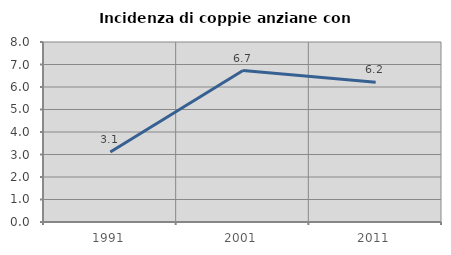
| Category | Incidenza di coppie anziane con figli |
|---|---|
| 1991.0 | 3.114 |
| 2001.0 | 6.731 |
| 2011.0 | 6.207 |